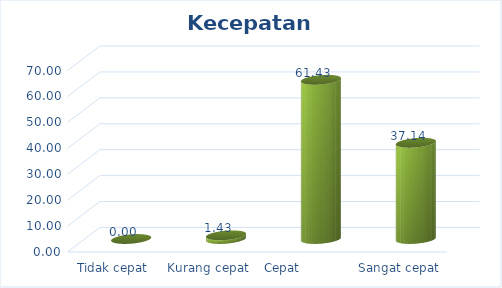
| Category | Kecepatan Pelayanan |
|---|---|
| Tidak cepat | 0 |
| Kurang cepat | 1.429 |
| Cepat            | 61.429 |
| Sangat cepat | 37.143 |